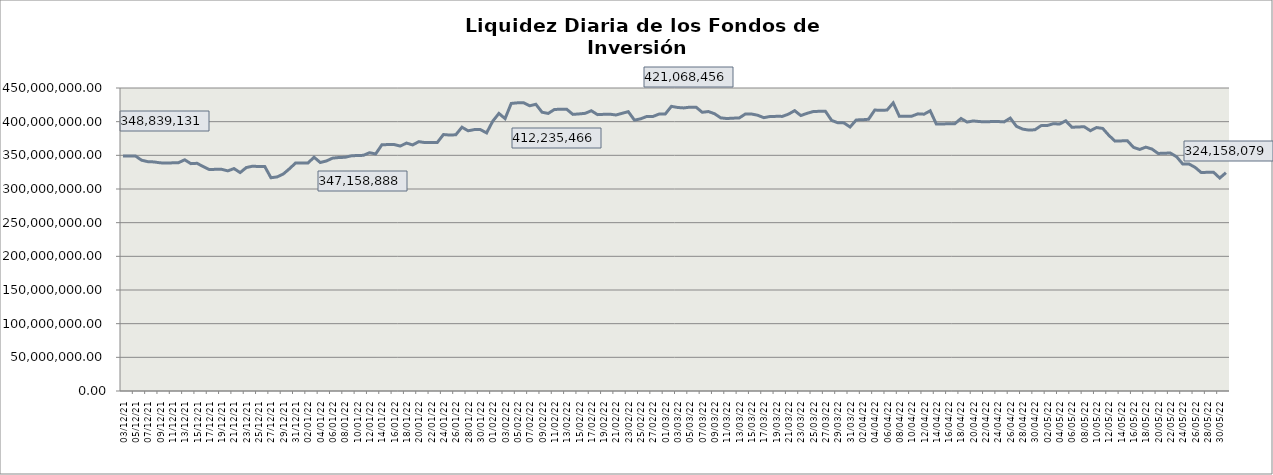
| Category | Series 0 |
|---|---|
| 2021-12-03 | 348839130.875 |
| 2021-12-04 | 349132411.002 |
| 2021-12-05 | 349105551.386 |
| 2021-12-06 | 342776841.146 |
| 2021-12-07 | 340641460.644 |
| 2021-12-08 | 340206966.905 |
| 2021-12-09 | 338890350.918 |
| 2021-12-10 | 338432858.614 |
| 2021-12-11 | 338843477.733 |
| 2021-12-12 | 339105667.547 |
| 2021-12-13 | 343364117.745 |
| 2021-12-14 | 337649655.632 |
| 2021-12-15 | 338163339.464 |
| 2021-12-16 | 333341908.093 |
| 2021-12-17 | 328882296.497 |
| 2021-12-18 | 329217772.163 |
| 2021-12-19 | 329208349.978 |
| 2021-12-20 | 326928500.5 |
| 2021-12-21 | 330329450.278 |
| 2021-12-22 | 324389259.77 |
| 2021-12-23 | 331844986.526 |
| 2021-12-24 | 333852622.143 |
| 2021-12-25 | 333393049.355 |
| 2021-12-26 | 333359266.749 |
| 2021-12-27 | 316726910.795 |
| 2021-12-28 | 317951071.922 |
| 2021-12-29 | 322254839.999 |
| 2021-12-30 | 330048132.978 |
| 2021-12-31 | 338614028.348 |
| 2022-01-01 | 338581109.28 |
| 2022-01-02 | 338558758.125 |
| 2022-01-03 | 347158887.928 |
| 2022-01-04 | 339349997.379 |
| 2022-01-05 | 341620701.411 |
| 2022-01-06 | 345827874.44 |
| 2022-01-07 | 346764053.585 |
| 2022-01-08 | 347079266.498 |
| 2022-01-09 | 349173840.888 |
| 2022-01-10 | 349799874.22 |
| 2022-01-11 | 349973605.184 |
| 2022-01-12 | 353906563.136 |
| 2022-01-13 | 352100786.595 |
| 2022-01-14 | 365579554.366 |
| 2022-01-15 | 366037559.037 |
| 2022-01-16 | 366004875.28 |
| 2022-01-17 | 363759833.712 |
| 2022-01-18 | 368259686.69 |
| 2022-01-19 | 365433396.061 |
| 2022-01-20 | 370321154.186 |
| 2022-01-21 | 368948739.238 |
| 2022-01-22 | 369082205.03 |
| 2022-01-23 | 369101440.435 |
| 2022-01-24 | 380889929.471 |
| 2022-01-25 | 380111223.659 |
| 2022-01-26 | 380507970.64 |
| 2022-01-27 | 391784463.071 |
| 2022-01-28 | 386447698.237 |
| 2022-01-29 | 388194921.503 |
| 2022-01-30 | 388180510.994 |
| 2022-01-31 | 383293091.923 |
| 2022-02-01 | 400757373.228 |
| 2022-02-02 | 412235465.942 |
| 2022-02-03 | 404516661.848 |
| 2022-02-04 | 427075813.442 |
| 2022-02-05 | 427961170.013 |
| 2022-02-06 | 428168347.568 |
| 2022-02-07 | 423605018.03 |
| 2022-02-08 | 425809056.474 |
| 2022-02-09 | 414035789.811 |
| 2022-02-10 | 412218139.901 |
| 2022-02-11 | 418062401.655 |
| 2022-02-12 | 418499624.264 |
| 2022-02-13 | 418462625.513 |
| 2022-02-14 | 410833964.588 |
| 2022-02-15 | 411496942.977 |
| 2022-02-16 | 412385779.885 |
| 2022-02-17 | 416214047.072 |
| 2022-02-18 | 410460800.174 |
| 2022-02-19 | 410886758.185 |
| 2022-02-20 | 411128387.371 |
| 2022-02-21 | 409921263.966 |
| 2022-02-22 | 412431234.744 |
| 2022-02-23 | 414871991.686 |
| 2022-02-24 | 402289624.171 |
| 2022-02-25 | 404225838.71 |
| 2022-02-26 | 407730830.664 |
| 2022-02-27 | 407693776.295 |
| 2022-02-28 | 411304282.028 |
| 2022-03-01 | 411311719.552 |
| 2022-03-02 | 422755060.294 |
| 2022-03-03 | 421068456.5 |
| 2022-03-04 | 420421546.944 |
| 2022-03-05 | 421573005.06 |
| 2022-03-06 | 421537345.15 |
| 2022-03-07 | 413927231.643 |
| 2022-03-08 | 415060570.853 |
| 2022-03-09 | 411784467.413 |
| 2022-03-10 | 405620918.883 |
| 2022-03-11 | 404661108.897 |
| 2022-03-12 | 405209220.314 |
| 2022-03-13 | 405445442.925 |
| 2022-03-14 | 411411555.807 |
| 2022-03-15 | 411382754.508 |
| 2022-03-16 | 409518318.858 |
| 2022-03-17 | 405943992.916 |
| 2022-03-18 | 407675390.866 |
| 2022-03-19 | 407877911.781 |
| 2022-03-20 | 407852822.541 |
| 2022-03-21 | 411157807.007 |
| 2022-03-22 | 416369091.343 |
| 2022-03-23 | 409108382.652 |
| 2022-03-24 | 412326954.86 |
| 2022-03-25 | 415000415.252 |
| 2022-03-26 | 415395802.991 |
| 2022-03-27 | 415386022.37 |
| 2022-03-28 | 401917496.137 |
| 2022-03-29 | 398390914.478 |
| 2022-03-30 | 398178574.671 |
| 2022-03-31 | 392099070.824 |
| 2022-04-01 | 402593684.462 |
| 2022-04-02 | 402799497.148 |
| 2022-04-03 | 403602747.244 |
| 2022-04-04 | 417231339.621 |
| 2022-04-05 | 416906454.745 |
| 2022-04-06 | 417218626.89 |
| 2022-04-07 | 427898762.59 |
| 2022-04-08 | 407874025.274 |
| 2022-04-09 | 408114761.44 |
| 2022-04-10 | 408123932.141 |
| 2022-04-11 | 411613493.849 |
| 2022-04-12 | 411112833.165 |
| 2022-04-13 | 416144500.349 |
| 2022-04-14 | 396450572.591 |
| 2022-04-15 | 396557880.751 |
| 2022-04-16 | 396906202.571 |
| 2022-04-17 | 396950765.911 |
| 2022-04-18 | 404741266.638 |
| 2022-04-19 | 399396867.83 |
| 2022-04-20 | 401111875.577 |
| 2022-04-21 | 400121732.025 |
| 2022-04-22 | 399801544.145 |
| 2022-04-23 | 400158155.796 |
| 2022-04-24 | 400205498.53 |
| 2022-04-25 | 399665056.913 |
| 2022-04-26 | 405295337.54 |
| 2022-04-27 | 393091928.132 |
| 2022-04-28 | 388989667.437 |
| 2022-04-29 | 387501396.15 |
| 2022-04-30 | 387937677.754 |
| 2022-05-01 | 394115802.395 |
| 2022-05-02 | 394227761.385 |
| 2022-05-03 | 397050796.272 |
| 2022-05-04 | 396406532.691 |
| 2022-05-05 | 401274576.462 |
| 2022-05-06 | 391655458.494 |
| 2022-05-07 | 392143624.664 |
| 2022-05-08 | 392446667.334 |
| 2022-05-09 | 386572208.478 |
| 2022-05-10 | 391302996.714 |
| 2022-05-11 | 389958185.232 |
| 2022-05-12 | 379695234.02 |
| 2022-05-13 | 371100827.578 |
| 2022-05-14 | 371449828.252 |
| 2022-05-15 | 371714293.249 |
| 2022-05-16 | 361863730.11 |
| 2022-05-17 | 358726435.079 |
| 2022-05-18 | 362184495.759 |
| 2022-05-19 | 359317976.952 |
| 2022-05-20 | 352760327.679 |
| 2022-05-21 | 353229073.117 |
| 2022-05-22 | 353342935.451 |
| 2022-05-23 | 347834120.559 |
| 2022-05-24 | 336995834.827 |
| 2022-05-25 | 337187311.449 |
| 2022-05-26 | 332116033.458 |
| 2022-05-27 | 324355787.048 |
| 2022-05-28 | 324836675.897 |
| 2022-05-29 | 324829296.295 |
| 2022-05-30 | 316286459.238 |
| 2022-05-31 | 324158079.371 |